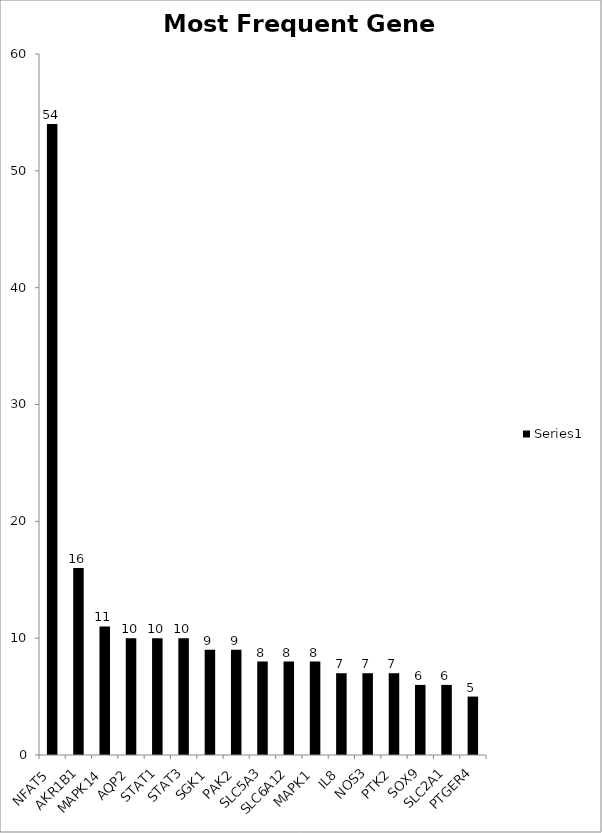
| Category | Series 0 |
|---|---|
| NFAT5 | 54 |
| AKR1B1 | 16 |
| MAPK14 | 11 |
| AQP2 | 10 |
| STAT1 | 10 |
| STAT3 | 10 |
| SGK1 | 9 |
| PAK2 | 9 |
| SLC5A3 | 8 |
| SLC6A12 | 8 |
| MAPK1 | 8 |
| IL8 | 7 |
| NOS3 | 7 |
| PTK2 | 7 |
| SOX9 | 6 |
| SLC2A1 | 6 |
| PTGER4 | 5 |